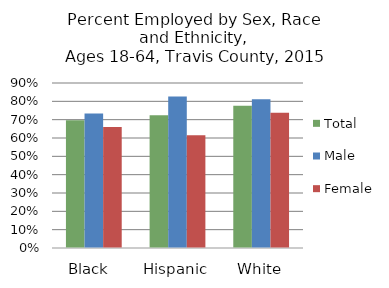
| Category | Total  | Male  | Female |
|---|---|---|---|
| Black  | 0.696 | 0.733 | 0.66 |
| Hispanic | 0.724 | 0.826 | 0.615 |
| White | 0.775 | 0.812 | 0.738 |